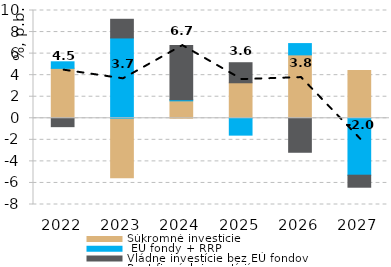
| Category | Súkromné investície |  EÚ fondy + RRP | Vládne investície bez EÚ fondov |
|---|---|---|---|
| 2022.0 | 4.63 | 0.61 | -0.778 |
| 2023.0 | -5.525 | 7.453 | 1.733 |
| 2024.0 | 1.618 | 0.101 | 5.024 |
| 2025.0 | 3.294 | -1.564 | 1.86 |
| 2026.0 | 5.884 | 1.046 | -3.154 |
| 2027.0 | 4.444 | -5.28 | -1.116 |